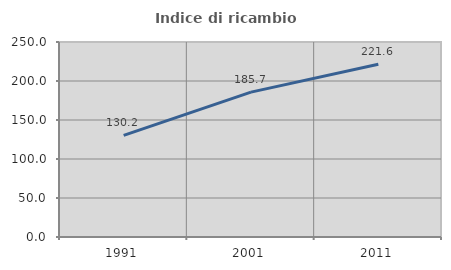
| Category | Indice di ricambio occupazionale  |
|---|---|
| 1991.0 | 130.189 |
| 2001.0 | 185.714 |
| 2011.0 | 221.569 |